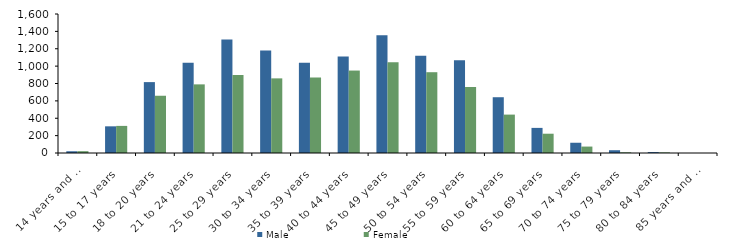
| Category | Male | Female |
|---|---|---|
| 14 years and under | 20 | 21 |
| 15 to 17 years | 307 | 312 |
| 18 to 20 years | 816 | 659 |
| 21 to 24 years | 1040 | 790 |
| 25 to 29 years | 1307 | 898 |
| 30 to 34 years | 1179 | 859 |
| 35 to 39 years | 1038 | 869 |
| 40 to 44 years | 1112 | 949 |
| 45 to 49 years | 1356 | 1044 |
| 50 to 54 years | 1118 | 930 |
| 55 to 59 years | 1069 | 760 |
| 60 to 64 years | 642 | 442 |
| 65 to 69 years | 289 | 222 |
| 70 to 74 years | 118 | 74 |
| 75 to 79 years | 32 | 8 |
| 80 to 84 years | 11 | 7 |
| 85 years and over | 0 | 0 |